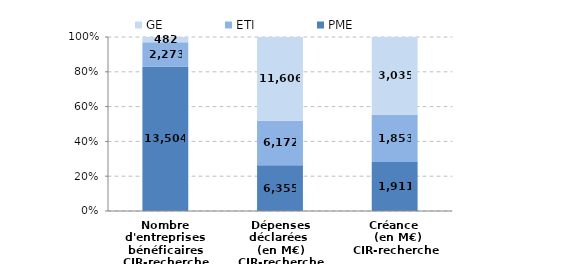
| Category | PME | ETI | GE |
|---|---|---|---|
| Nombre d'entreprises bénéficaires
CIR-recherche | 13504 | 2273 | 482 |
| Dépenses déclarées 
(en M€)
CIR-recherche | 6354.76 | 6172.26 | 11606.05 |
| Créance 
 (en M€)
CIR-recherche | 1910.54 | 1852.87 | 3035.23 |